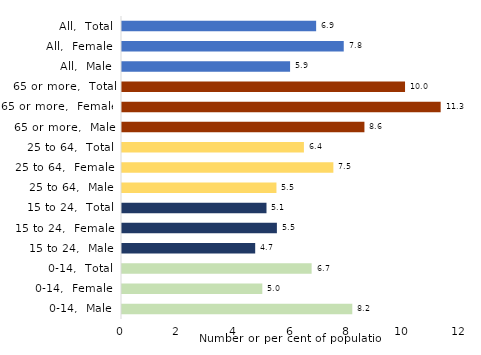
| Category | Series 0 |
|---|---|
| 0-14,  Male | 8.152 |
| 0-14,  Female | 4.967 |
| 0-14,  Total | 6.712 |
| 15 to 24,  Male | 4.715 |
| 15 to 24,  Female | 5.483 |
| 15 to 24,  Total | 5.115 |
| 25 to 64,  Male | 5.467 |
| 25 to 64,  Female | 7.482 |
| 25 to 64,  Total | 6.439 |
| 65 or more,  Male | 8.582 |
| 65 or more,  Female | 11.28 |
| 65 or more,  Total | 10.019 |
| All,  Male | 5.95 |
| All,  Female | 7.849 |
| All,  Total | 6.872 |